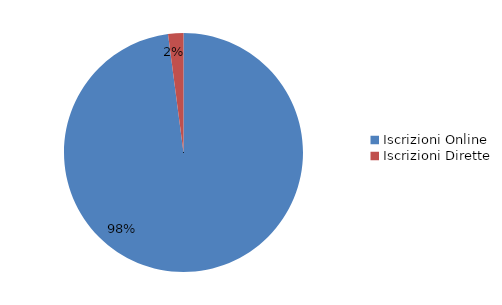
| Category | Series 0 |
|---|---|
| Iscrizioni Online | 114242 |
| Iscrizioni Dirette | 2416 |